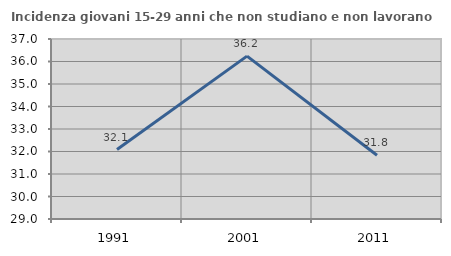
| Category | Incidenza giovani 15-29 anni che non studiano e non lavorano  |
|---|---|
| 1991.0 | 32.088 |
| 2001.0 | 36.24 |
| 2011.0 | 31.836 |